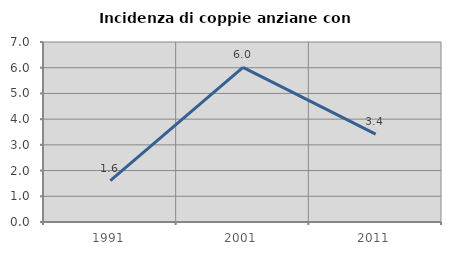
| Category | Incidenza di coppie anziane con figli |
|---|---|
| 1991.0 | 1.613 |
| 2001.0 | 6.015 |
| 2011.0 | 3.419 |